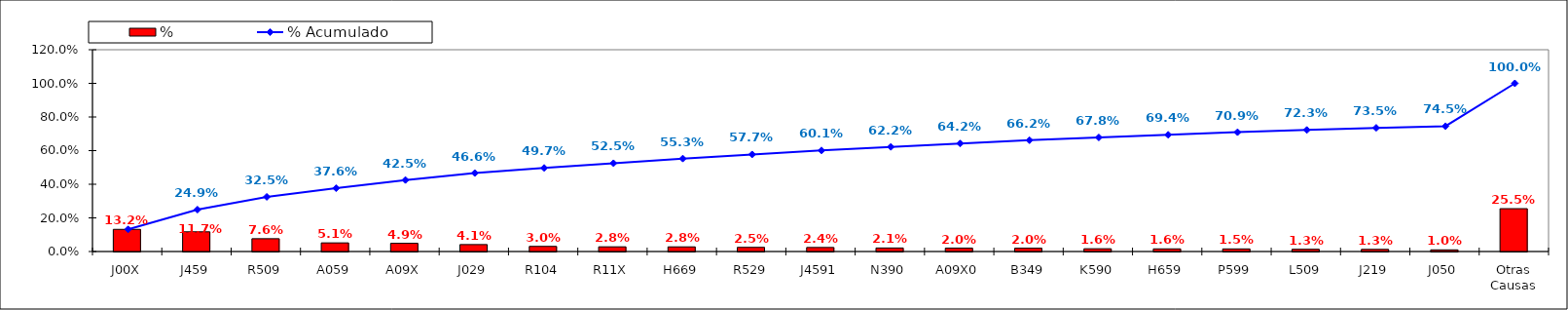
| Category | % |
|---|---|
| J00X | 0.132 |
| J459 | 0.117 |
| R509 | 0.076 |
| A059 | 0.051 |
| A09X | 0.049 |
| J029 | 0.041 |
| R104 | 0.03 |
| R11X | 0.028 |
| H669 | 0.028 |
| R529 | 0.025 |
| J4591 | 0.024 |
| N390 | 0.021 |
| A09X0 | 0.02 |
| B349 | 0.02 |
| K590 | 0.016 |
| H659 | 0.016 |
| P599 | 0.015 |
| L509 | 0.013 |
| J219 | 0.013 |
| J050 | 0.01 |
| Otras Causas | 0.255 |